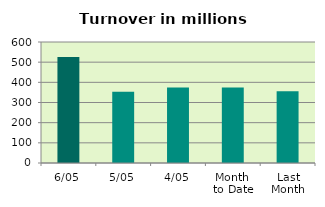
| Category | Series 0 |
|---|---|
| 6/05 | 525.69 |
| 5/05 | 353.217 |
| 4/05 | 374.017 |
| Month 
to Date | 374.954 |
| Last
Month | 356.105 |